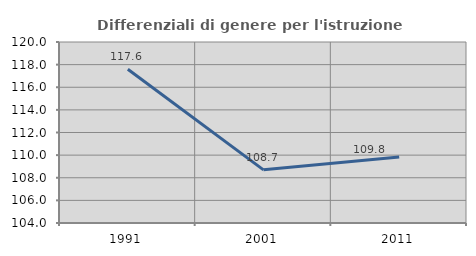
| Category | Differenziali di genere per l'istruzione superiore |
|---|---|
| 1991.0 | 117.593 |
| 2001.0 | 108.699 |
| 2011.0 | 109.845 |